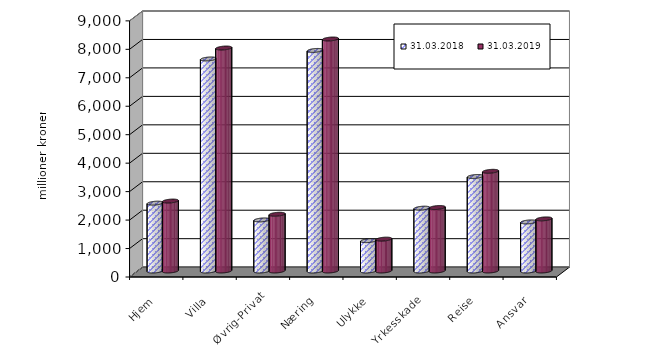
| Category | 31.03.2018 | 31.03.2019 |
|---|---|---|
| Hjem | 2383.873 | 2457.488 |
| Villa | 7450.826 | 7835.075 |
| Øvrig-Privat | 1794.842 | 1993.975 |
| Næring | 7750.567 | 8151.813 |
| Ulykke | 1066.837 | 1119.845 |
| Yrkesskade | 2207.634 | 2231.053 |
| Reise | 3320.904 | 3502.821 |
| Ansvar | 1725.082 | 1831.345 |